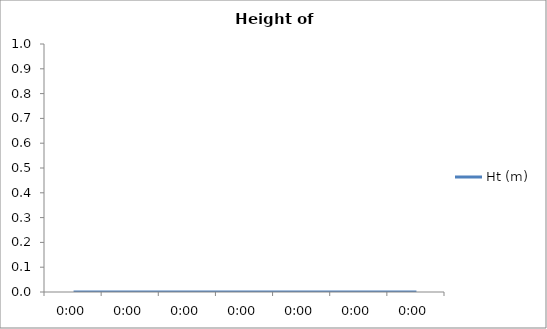
| Category | Ht (m) |
|---|---|
| 0.0 | 0 |
| 0.0 | 0 |
| 0.0 | 0 |
| 0.0 | 0 |
| 0.0 | 0 |
| 0.0 | 0 |
| 0.0 | 0 |